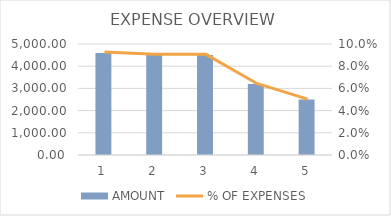
| Category | AMOUNT |
|---|---|
| 0 | 4600 |
| 1 | 4500 |
| 2 | 4500 |
| 3 | 3200 |
| 4 | 2500 |